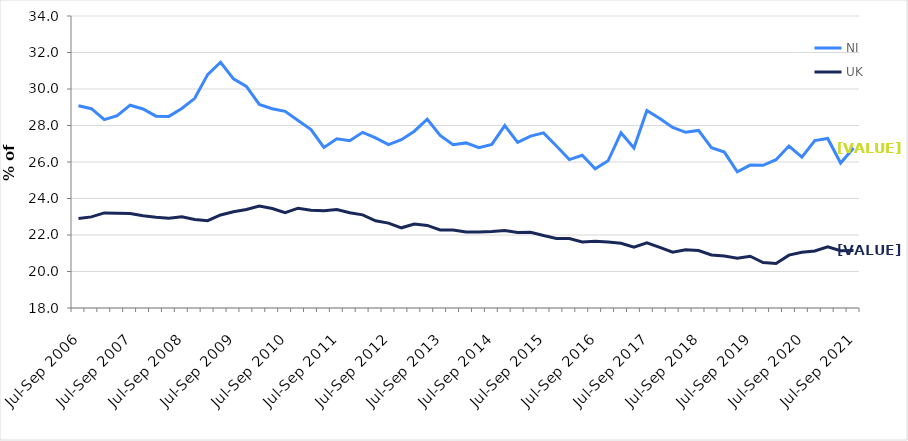
| Category | NI | UK |
|---|---|---|
| Jul-Sep 2006 | 29.082 | 22.904 |
| Oct-Dec 2006 | 28.92 | 22.992 |
| Jan-Mar 2007 | 28.32 | 23.21 |
| Apr-Jun 2007 | 28.541 | 23.196 |
| Jul-Sep 2007 | 29.113 | 23.179 |
| Oct-Dec 2007 | 28.904 | 23.058 |
| Jan-Mar 2008 | 28.512 | 22.974 |
| Apr-Jun 2008 | 28.5 | 22.917 |
| Jul-Sep 2008 | 28.937 | 22.996 |
| Oct-Dec 2008 | 29.489 | 22.851 |
| Jan-Mar 2009 | 30.792 | 22.786 |
| Apr-Jun 2009 | 31.467 | 23.097 |
| Jul-Sep 2009 | 30.556 | 23.27 |
| Oct-Dec 2009 | 30.141 | 23.397 |
| Jan-Mar 2010 | 29.156 | 23.588 |
| Apr-Jun 2010 | 28.921 | 23.451 |
| Jul-Sep 2010 | 28.774 | 23.219 |
| Oct-Dec 2010 | 28.271 | 23.468 |
| Jan-Mar 2011 | 27.775 | 23.36 |
| Apr-Jun 2011 | 26.796 | 23.329 |
| Jul-Sep 2011 | 27.268 | 23.397 |
| Oct-Dec 2011 | 27.162 | 23.215 |
| Jan-Mar 2012 | 27.624 | 23.102 |
| Apr-Jun 2012 | 27.319 | 22.778 |
| Jul-Sep 2012 | 26.95 | 22.65 |
| Oct-Dec 2012 | 27.223 | 22.394 |
| Jan-Mar 2013 | 27.687 | 22.596 |
| Apr-Jun 2013 | 28.342 | 22.526 |
| Jul-Sep 2013 | 27.453 | 22.276 |
| Oct-Dec 2013 | 26.952 | 22.273 |
| Jan-Mar 2014 | 27.046 | 22.16 |
| Apr-Jun 2014 | 26.785 | 22.163 |
| Jul-Sep 2014 | 26.965 | 22.188 |
| Oct-Dec 2014 | 27.993 | 22.252 |
| Jan-Mar 2015 | 27.073 | 22.142 |
| Apr-Jun 2015 | 27.421 | 22.145 |
| Jul-Sep 2015 | 27.594 | 21.97 |
| Oct-Dec 2015 | 26.877 | 21.812 |
| Jan-Mar 2016 | 26.132 | 21.803 |
| Apr-Jun 2016 | 26.367 | 21.623 |
| Jul-Sep 2016 | 25.625 | 21.656 |
| Oct-Dec 2016 | 26.067 | 21.619 |
| Jan-Mar 2017 | 27.6 | 21.55 |
| Apr-Jun 2017 | 26.77 | 21.333 |
| Jul-Sep 2017 | 28.826 | 21.576 |
| Oct-Dec 2017 | 28.379 | 21.325 |
| Jan-Mar 2018 | 27.894 | 21.055 |
| Apr-Jun 2018 | 27.628 | 21.189 |
| Jul-Sep 2018 | 27.731 | 21.147 |
| Oct-Dec 2018 | 26.784 | 20.91 |
| Jan-Mar 2019 | 26.543 | 20.844 |
| Apr-Jun 2019 | 25.457 | 20.721 |
| Jul-Sep 2019 | 25.833 | 20.838 |
| Oct-Dec 2019 | 25.816 | 20.491 |
| Jan-Mar 2020 | 26.126 | 20.437 |
| Apr-Jun 2020 | 26.875 | 20.896 |
| Jul-Sep 2020 | 26.267 | 21.05 |
| Oct-Dec 2020 | 27.177 | 21.129 |
| Jan-Mar 2021 | 27.288 | 21.352 |
| Apr-Jun 2021 | 25.942 | 21.139 |
| Jul-Sep 2021 | 26.766 | 21.15 |